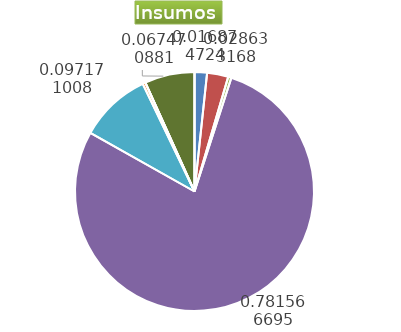
| Category | Series 0 |
|---|---|
| Control arvenses | 731220 |
| Control fitosanitario | 1240740 |
| Cosecha y beneficio | 189643.822 |
| Fertilización | 33867054 |
| Instalación | 4210639.707 |
| Otros | 169300 |
| Podas | 0 |
| Riego | 0 |
| Transporte | 2923666 |
| Tutorado | 0 |